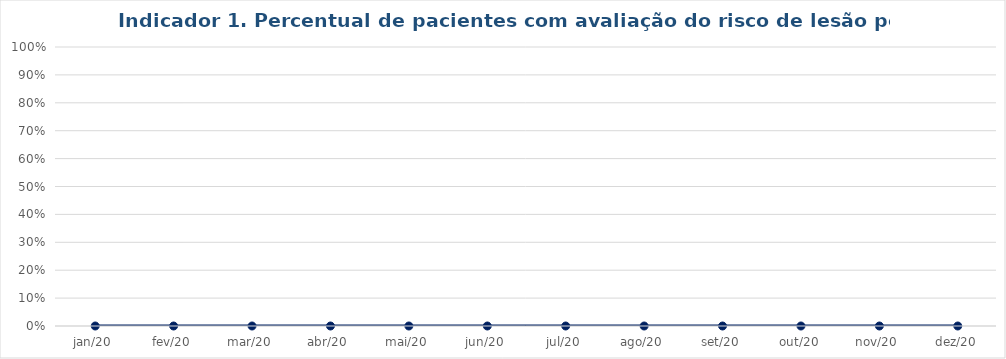
| Category | Total |
|---|---|
| jan/20 | 0 |
| fev/20 | 0 |
| mar/20 | 0 |
| abr/20 | 0 |
| mai/20 | 0 |
| jun/20 | 0 |
| jul/20 | 0 |
| ago/20 | 0 |
| set/20 | 0 |
| out/20 | 0 |
| nov/20 | 0 |
| dez/20 | 0 |